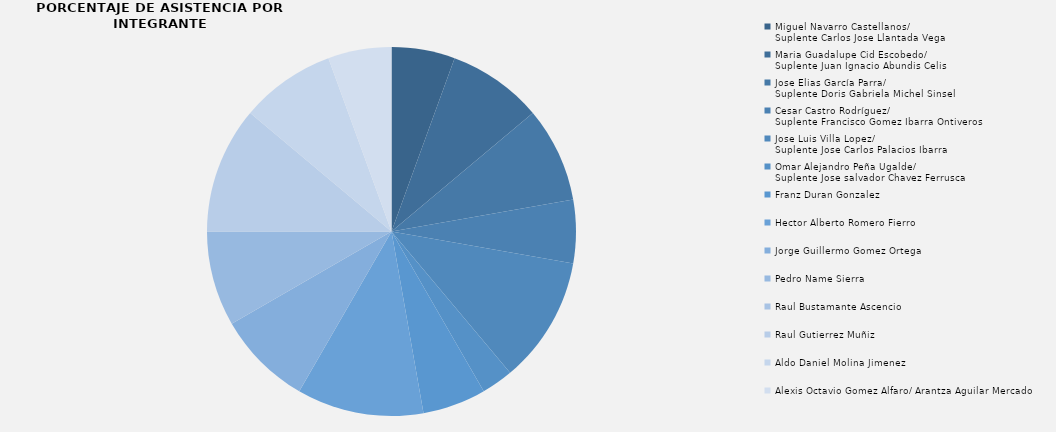
| Category | Series 0 |
|---|---|
| Miguel Navarro Castellanos/ 
Suplente Carlos Jose Llantada Vega  | 2 |
| Maria Guadalupe Cid Escobedo/
Suplente Juan Ignacio Abundis Celis  | 3 |
| Jose Elias García Parra/
Suplente Doris Gabriela Michel Sinsel | 3 |
| Cesar Castro Rodríguez/
Suplente Francisco Gomez Ibarra Ontiveros | 2 |
| Jose Luis Villa Lopez/
Suplente Jose Carlos Palacios Ibarra | 4 |
| Omar Alejandro Peña Ugalde/
Suplente Jose salvador Chavez Ferrusca | 1 |
| Franz Duran Gonzalez  | 2 |
| Hector Alberto Romero Fierro | 4 |
| Jorge Guillermo Gomez Ortega  | 3 |
| Pedro Name Sierra  | 3 |
| Raul Bustamante Ascencio  | 0 |
| Raul Gutierrez Muñiz  | 4 |
| Aldo Daniel Molina Jimenez  | 3 |
| Alexis Octavio Gomez Alfaro/ Arantza Aguilar Mercado | 2 |